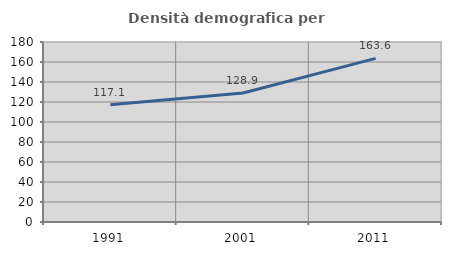
| Category | Densità demografica |
|---|---|
| 1991.0 | 117.14 |
| 2001.0 | 128.931 |
| 2011.0 | 163.627 |